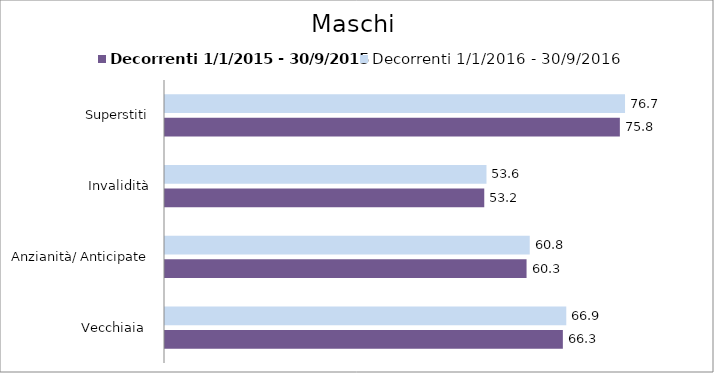
| Category | Decorrenti 1/1/2015 - 30/9/2015 | Decorrenti 1/1/2016 - 30/9/2016 |
|---|---|---|
| Vecchiaia  | 66.31 | 66.88 |
| Anzianità/ Anticipate | 60.26 | 60.79 |
| Invalidità | 53.21 | 53.58 |
| Superstiti | 75.81 | 76.67 |